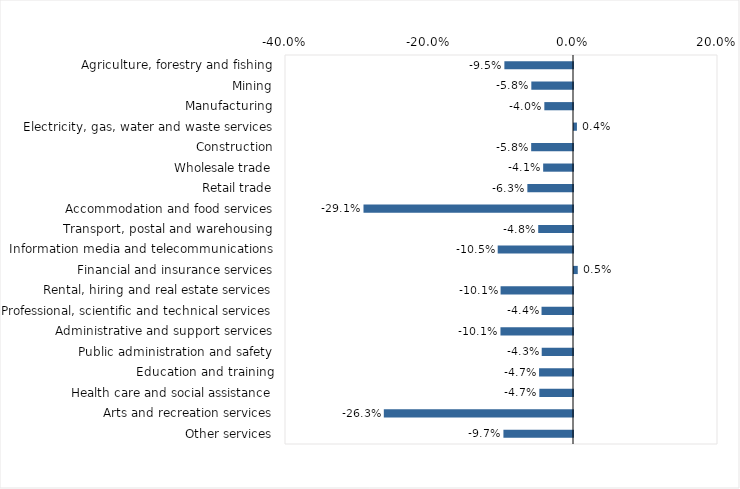
| Category | This week |
|---|---|
| Agriculture, forestry and fishing | -0.095 |
| Mining | -0.058 |
| Manufacturing | -0.04 |
| Electricity, gas, water and waste services | 0.004 |
| Construction | -0.058 |
| Wholesale trade | -0.041 |
| Retail trade | -0.063 |
| Accommodation and food services | -0.291 |
| Transport, postal and warehousing | -0.048 |
| Information media and telecommunications | -0.105 |
| Financial and insurance services | 0.005 |
| Rental, hiring and real estate services | -0.101 |
| Professional, scientific and technical services | -0.044 |
| Administrative and support services | -0.101 |
| Public administration and safety | -0.043 |
| Education and training | -0.047 |
| Health care and social assistance | -0.047 |
| Arts and recreation services | -0.263 |
| Other services | -0.097 |